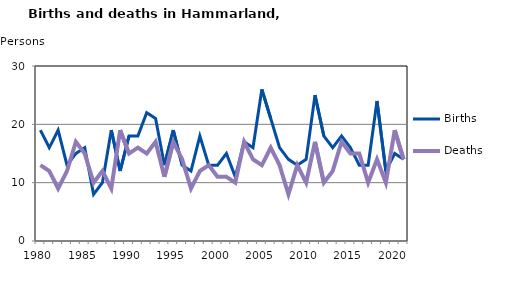
| Category | Births | Deaths |
|---|---|---|
| 1980.0 | 19 | 13 |
| 1981.0 | 16 | 12 |
| 1982.0 | 19 | 9 |
| 1983.0 | 13 | 12 |
| 1984.0 | 15 | 17 |
| 1985.0 | 16 | 15 |
| 1986.0 | 8 | 10 |
| 1987.0 | 10 | 12 |
| 1988.0 | 19 | 9 |
| 1989.0 | 12 | 19 |
| 1990.0 | 18 | 15 |
| 1991.0 | 18 | 16 |
| 1992.0 | 22 | 15 |
| 1993.0 | 21 | 17 |
| 1994.0 | 13 | 11 |
| 1995.0 | 19 | 17 |
| 1996.0 | 13 | 14 |
| 1997.0 | 12 | 9 |
| 1998.0 | 18 | 12 |
| 1999.0 | 13 | 13 |
| 2000.0 | 13 | 11 |
| 2001.0 | 15 | 11 |
| 2002.0 | 11 | 10 |
| 2003.0 | 17 | 17 |
| 2004.0 | 16 | 14 |
| 2005.0 | 26 | 13 |
| 2006.0 | 21 | 16 |
| 2007.0 | 16 | 13 |
| 2008.0 | 14 | 8 |
| 2009.0 | 13 | 13 |
| 2010.0 | 14 | 10 |
| 2011.0 | 25 | 17 |
| 2012.0 | 18 | 10 |
| 2013.0 | 16 | 12 |
| 2014.0 | 18 | 17 |
| 2015.0 | 16 | 15 |
| 2016.0 | 13 | 15 |
| 2017.0 | 13 | 10 |
| 2018.0 | 24 | 14 |
| 2019.0 | 12 | 10 |
| 2020.0 | 15 | 19 |
| 2021.0 | 14 | 14 |